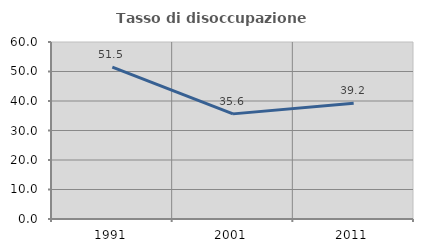
| Category | Tasso di disoccupazione giovanile  |
|---|---|
| 1991.0 | 51.495 |
| 2001.0 | 35.637 |
| 2011.0 | 39.216 |